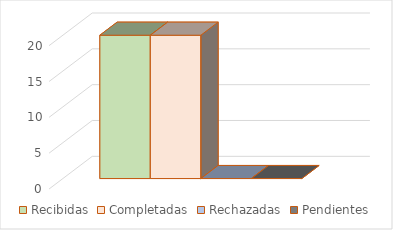
| Category | Recibidas | Completadas | Rechazadas | Pendientes |
|---|---|---|---|---|
| 0 | 20 | 20 | 0 | 0 |